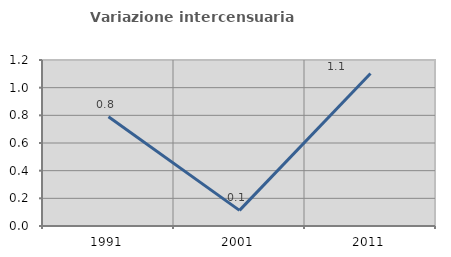
| Category | Variazione intercensuaria annua |
|---|---|
| 1991.0 | 0.789 |
| 2001.0 | 0.113 |
| 2011.0 | 1.103 |